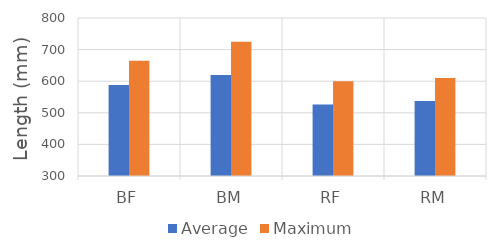
| Category | Average | Maximum |
|---|---|---|
| BF | 588 | 665 |
| BM | 620 | 725 |
| RF | 526 | 600 |
| RM | 537 | 610 |